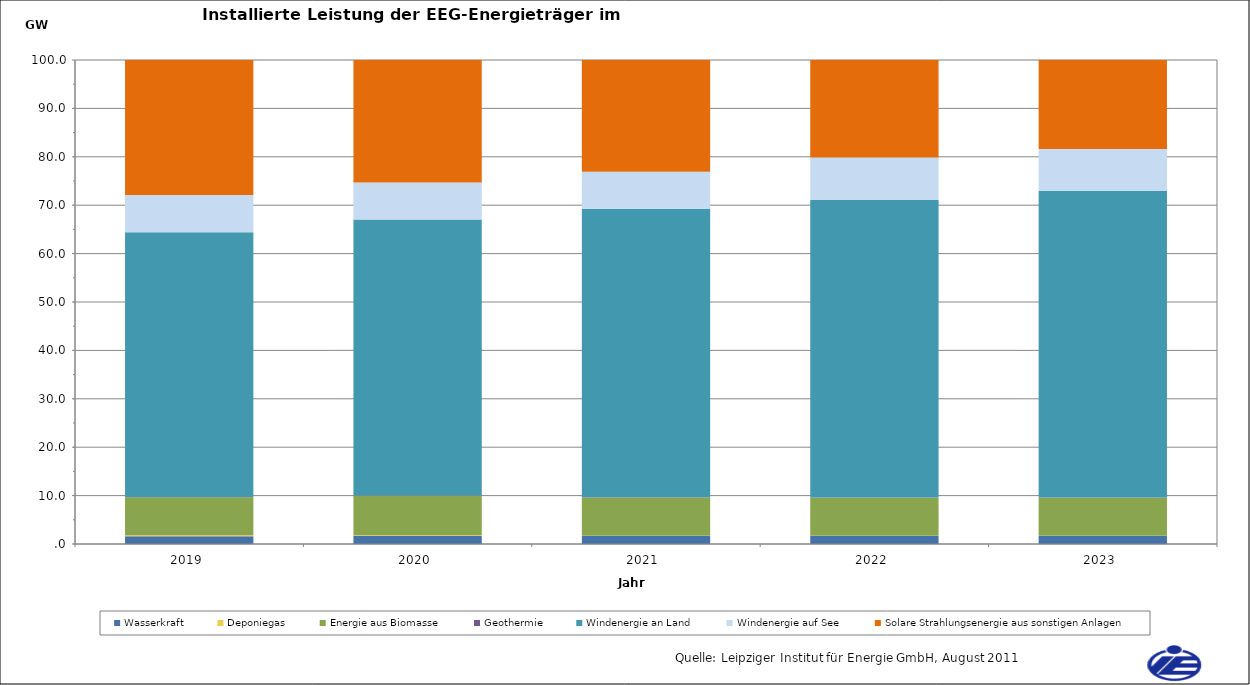
| Category | Wasserkraft | Deponiegas | Energie aus Biomasse | Geothermie | Windenergie an Land | Windenergie auf See | Solare Strahlungsenergie aus sonstigen Anlagen |
|---|---|---|---|---|---|---|---|
| 2019.0 | 1617.52 | 172.56 | 7875 | 47.21 | 54711.79 | 7659 | 34151.29 |
| 2020.0 | 1629.11 | 171.52 | 8149.14 | 51.11 | 57038.59 | 7659 | 35970.98 |
| 2021.0 | 1640.7 | 77.08 | 7899.28 | 55.02 | 59570.29 | 7659 | 37837.86 |
| 2022.0 | 1652.29 | 55.43 | 7838.37 | 58.92 | 61532.46 | 8716.9 | 38876.01 |
| 2023.0 | 1663.88 | 52.31 | 7837.91 | 62.82 | 63302 | 8716.9 | 39908.02 |